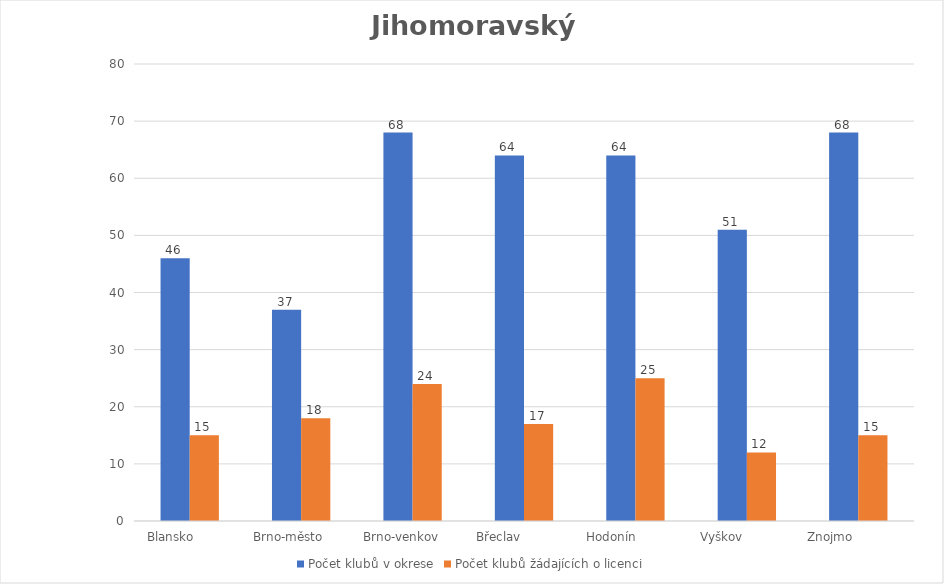
| Category | Počet klubů v okrese | Počet klubů žádajících o licenci |
|---|---|---|
| Blansko          | 46 | 15 |
| Brno-město       | 37 | 18 |
| Brno-venkov      | 68 | 24 |
| Břeclav             | 64 | 17 |
| Hodonín             | 64 | 25 |
| Vyškov             | 51 | 12 |
| Znojmo               | 68 | 15 |